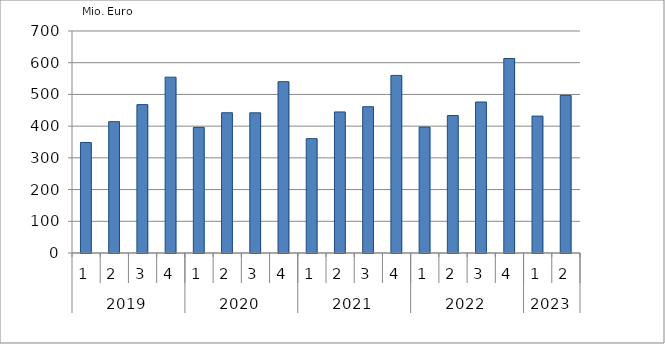
| Category | Ausbaugewerblicher Umsatz3 |
|---|---|
| 0 | 348466.115 |
| 1 | 414145.554 |
| 2 | 467849.207 |
| 3 | 554369.34 |
| 4 | 395996.128 |
| 5 | 442270.528 |
| 6 | 441987.109 |
| 7 | 540250.513 |
| 8 | 360578.959 |
| 9 | 444796.964 |
| 10 | 461290.095 |
| 11 | 559989.337 |
| 12 | 396959.135 |
| 13 | 433420.546 |
| 14 | 476099.112 |
| 15 | 613244.901 |
| 16 | 431755.233 |
| 17 | 497030.878 |